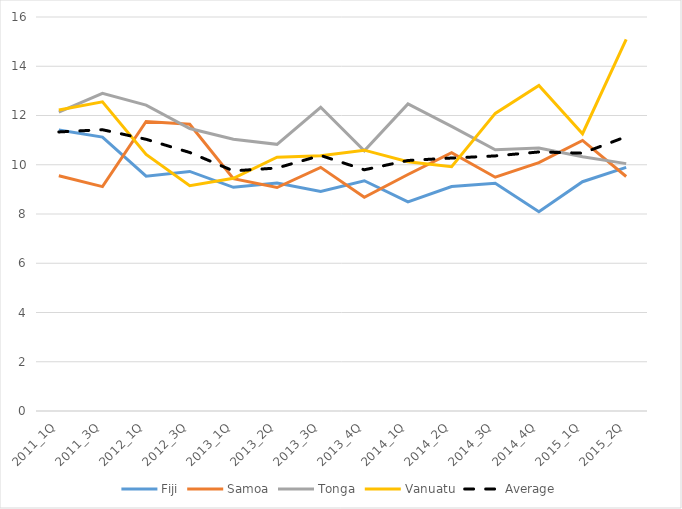
| Category | Fiji | Samoa | Tonga | Vanuatu | Average |
|---|---|---|---|---|---|
| 2011_1Q | 11.409 | 9.554 | 12.139 | 12.226 | 11.332 |
| 2011_3Q | 11.125 | 9.111 | 12.9 | 12.554 | 11.422 |
| 2012_1Q | 9.538 | 11.758 | 12.422 | 10.416 | 11.034 |
| 2012_3Q | 9.729 | 11.643 | 11.472 | 9.148 | 10.498 |
| 2013_1Q | 9.083 | 9.435 | 11.034 | 9.452 | 9.751 |
| 2013_2Q | 9.26 | 9.074 | 10.83 | 10.309 | 9.868 |
| 2013_3Q | 8.919 | 9.893 | 12.334 | 10.362 | 10.377 |
| 2013_4Q | 9.35 | 8.679 | 10.563 | 10.592 | 9.796 |
| 2014_1Q | 8.492 | 9.605 | 12.47 | 10.123 | 10.173 |
| 2014_2Q | 9.116 | 10.49 | 11.562 | 9.922 | 10.273 |
| 2014_3Q | 9.25 | 9.494 | 10.605 | 12.085 | 10.358 |
| 2014_4Q | 8.093 | 10.084 | 10.679 | 13.223 | 10.52 |
| 2015_1Q | 9.31 | 10.987 | 10.324 | 11.259 | 10.47 |
| 2015_2Q | 9.894 | 9.523 | 10.045 | 15.096 | 11.139 |